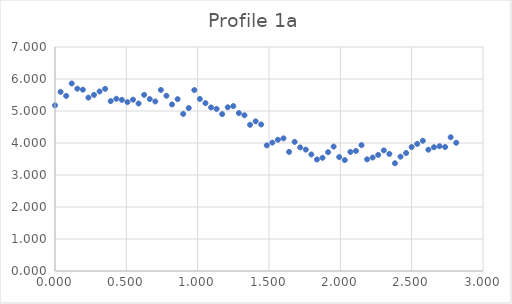
| Category | Series 0 |
|---|---|
| 0.0 | 5.178 |
| 0.0390625 | 5.598 |
| 0.078125 | 5.471 |
| 0.1171875 | 5.86 |
| 0.15625 | 5.698 |
| 0.1953125 | 5.666 |
| 0.234375 | 5.418 |
| 0.2734375 | 5.503 |
| 0.3125 | 5.61 |
| 0.3515625 | 5.692 |
| 0.390625 | 5.308 |
| 0.4296875 | 5.382 |
| 0.46875 | 5.348 |
| 0.5078125 | 5.278 |
| 0.546875 | 5.354 |
| 0.5859375 | 5.234 |
| 0.625 | 5.505 |
| 0.6640625 | 5.373 |
| 0.703125 | 5.298 |
| 0.7421875 | 5.658 |
| 0.78125 | 5.476 |
| 0.8203125 | 5.205 |
| 0.859375 | 5.37 |
| 0.8984375 | 4.909 |
| 0.9375 | 5.093 |
| 0.9765625 | 5.655 |
| 1.015625 | 5.376 |
| 1.0546875 | 5.247 |
| 1.09375 | 5.112 |
| 1.1328125 | 5.065 |
| 1.171875 | 4.903 |
| 1.2109375 | 5.116 |
| 1.25 | 5.153 |
| 1.2890625 | 4.935 |
| 1.328125 | 4.867 |
| 1.3671875 | 4.568 |
| 1.40625 | 4.677 |
| 1.4453125 | 4.579 |
| 1.484375 | 3.926 |
| 1.5234375 | 4.012 |
| 1.5625 | 4.101 |
| 1.6015625 | 4.145 |
| 1.640625 | 3.721 |
| 1.6796875 | 4.036 |
| 1.71875 | 3.863 |
| 1.7578125 | 3.793 |
| 1.796875 | 3.642 |
| 1.8359375 | 3.485 |
| 1.875 | 3.538 |
| 1.9140625 | 3.712 |
| 1.953125 | 3.888 |
| 1.9921875 | 3.562 |
| 2.03125 | 3.467 |
| 2.0703125 | 3.721 |
| 2.109375 | 3.752 |
| 2.1484375 | 3.934 |
| 2.1875 | 3.489 |
| 2.2265625 | 3.546 |
| 2.265625 | 3.628 |
| 2.3046875 | 3.769 |
| 2.34375 | 3.658 |
| 2.3828125 | 3.367 |
| 2.421875 | 3.573 |
| 2.4609375 | 3.687 |
| 2.5 | 3.874 |
| 2.5390625 | 3.972 |
| 2.578125 | 4.071 |
| 2.6171875 | 3.791 |
| 2.65625 | 3.868 |
| 2.6953125 | 3.9 |
| 2.734375 | 3.875 |
| 2.7734375 | 4.18 |
| 2.8125 | 4.008 |